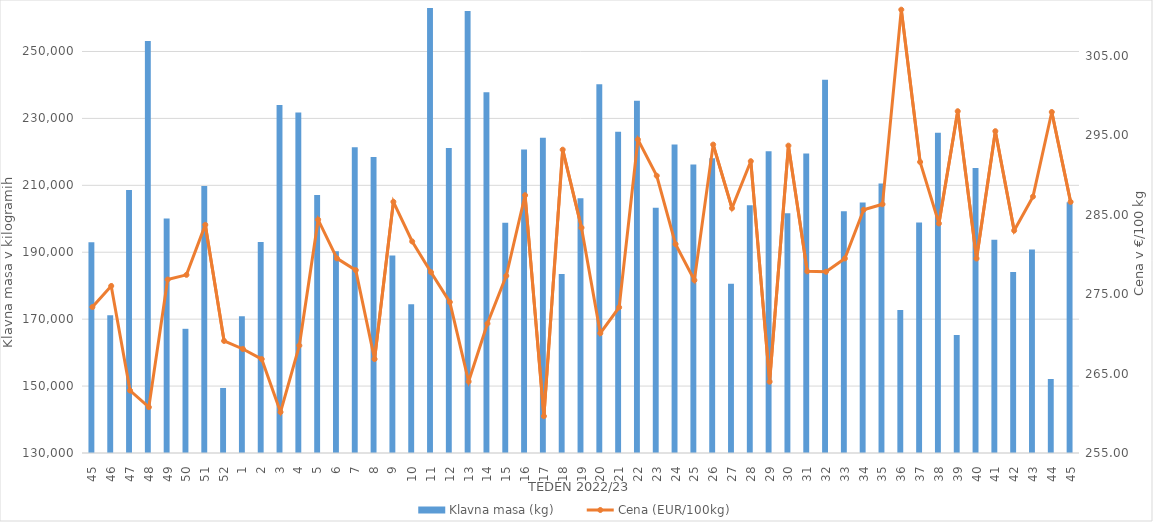
| Category | Klavna masa (kg) |
|---|---|
| 45.0 | 193022 |
| 46.0 | 171172 |
| 47.0 | 208597 |
| 48.0 | 253151 |
| 49.0 | 200117 |
| 50.0 | 167119 |
| 51.0 | 209797 |
| 52.0 | 149439 |
| 1.0 | 170843 |
| 2.0 | 193093 |
| 3.0 | 234042 |
| 4.0 | 231737 |
| 5.0 | 207136 |
| 6.0 | 190311 |
| 7.0 | 221366 |
| 8.0 | 218470 |
| 9.0 | 189006 |
| 10.0 | 174425 |
| 11.0 | 265476 |
| 12.0 | 221171 |
| 13.0 | 262102 |
| 14.0 | 237813 |
| 15.0 | 198828 |
| 16.0 | 220686 |
| 17.0 | 224192 |
| 18.0 | 183508 |
| 19.0 | 206133 |
| 20.0 | 240223 |
| 21.0 | 226050 |
| 22.0 | 235273 |
| 23.0 | 203306 |
| 24.0 | 222178 |
| 25.0 | 216259 |
| 26.0 | 218064 |
| 27.0 | 180556 |
| 28.0 | 204078 |
| 29.0 | 220162 |
| 30.0 | 201649 |
| 31.0 | 219538 |
| 32.0 | 241549 |
| 33.0 | 202261 |
| 34.0 | 204903 |
| 35.0 | 210575 |
| 36.0 | 172745 |
| 37.0 | 198877 |
| 38.0 | 225730 |
| 39.0 | 165273 |
| 40.0 | 215175 |
| 41.0 | 193769 |
| 42.0 | 184122 |
| 43.0 | 190834 |
| 44.0 | 152119 |
| 45.0 | 204974 |